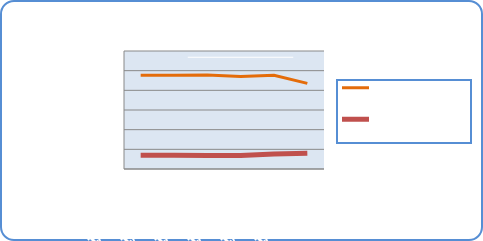
| Category | Motorin Türleri | Benzin Türleri |
|---|---|---|
| 1/21/19 | 47637691.724 | 6945269.984 |
| 1/22/19 | 47699158.505 | 6960450.947 |
| 1/23/19 | 47783681.403 | 6862373.922 |
| 1/24/19 | 47032635.427 | 6867771.927 |
| 1/25/19 | 47684819.388 | 7636074.11 |
| 1/26/19 | 43537937.752 | 8033706.56 |